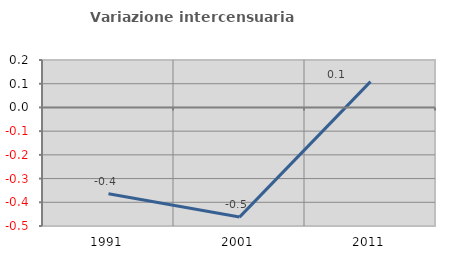
| Category | Variazione intercensuaria annua |
|---|---|
| 1991.0 | -0.364 |
| 2001.0 | -0.462 |
| 2011.0 | 0.109 |